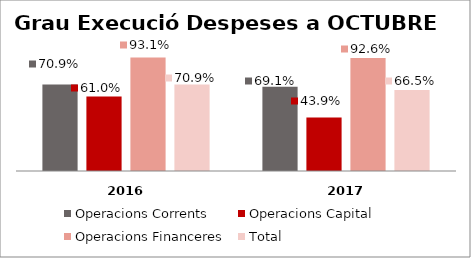
| Category | Operacions Corrents | Operacions Capital | Operacions Financeres | Total |
|---|---|---|---|---|
| 0 | 0.709 | 0.61 | 0.931 | 0.709 |
| 1 | 0.691 | 0.439 | 0.926 | 0.665 |